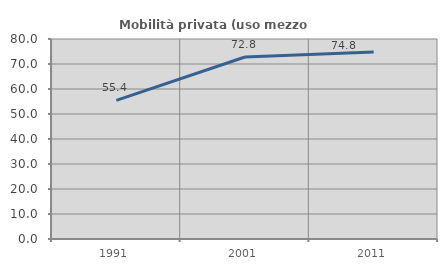
| Category | Mobilità privata (uso mezzo privato) |
|---|---|
| 1991.0 | 55.445 |
| 2001.0 | 72.811 |
| 2011.0 | 74.783 |